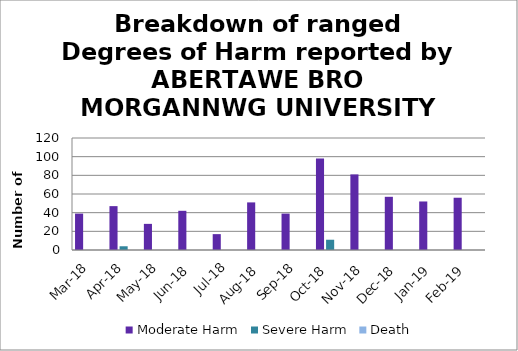
| Category | Moderate Harm | Severe Harm | Death |
|---|---|---|---|
| Mar-18 | 39 | 0 | 0 |
| Apr-18 | 47 | 4 | 0 |
| May-18 | 28 | 0 | 0 |
| Jun-18 | 42 | 0 | 0 |
| Jul-18 | 17 | 0 | 0 |
| Aug-18 | 51 | 0 | 0 |
| Sep-18 | 39 | 0 | 0 |
| Oct-18 | 98 | 11 | 0 |
| Nov-18 | 81 | 0 | 0 |
| Dec-18 | 57 | 0 | 0 |
| Jan-19 | 52 | 0 | 0 |
| Feb-19 | 56 | 0 | 0 |